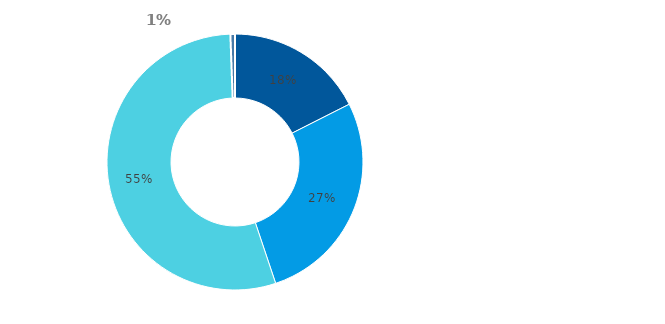
| Category | Series 3 |
|---|---|
| Hotovost | 0.176 |
| Půjčky poskytnuté nemovitostní společnosti | 0.273 |
| Majetkové účasti v nemovitostní společnosti | 0.546 |
| Ostatní finanční aktiva | 0.006 |